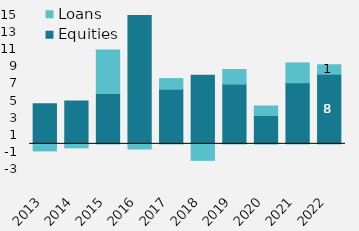
| Category | Equities | Loans |
|---|---|---|
| 2013 | 4684.619 | -826.326 |
| 2014 | 4993.013 | -467.51 |
| 2015 | 5883.814 | 5084.686 |
| 2016 | 15183.916 | -605.406 |
| 2017 | 6384.341 | 1239.994 |
| 2018 | 8019.152 | -1932.555 |
| 2019 | 6983.587 | 1706.02 |
| 2020 | 3310.268 | 1114.326 |
| 2021 | 7134.57 | 2321 |
| 2022 | 8138 | 1103 |